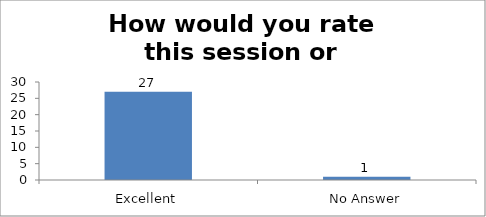
| Category | How would you rate this session or workshop? |
|---|---|
| Excellent | 27 |
| No Answer | 1 |